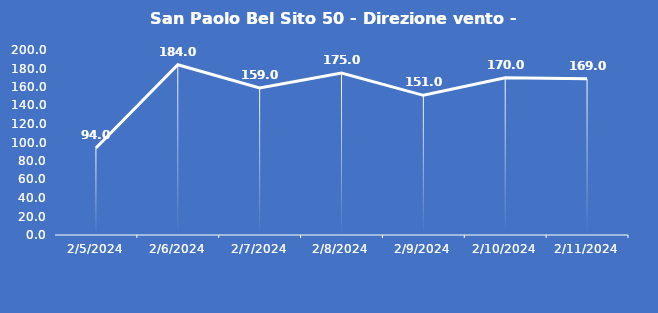
| Category | San Paolo Bel Sito 50 - Direzione vento - Grezzo (°N) |
|---|---|
| 2/5/24 | 94 |
| 2/6/24 | 184 |
| 2/7/24 | 159 |
| 2/8/24 | 175 |
| 2/9/24 | 151 |
| 2/10/24 | 170 |
| 2/11/24 | 169 |